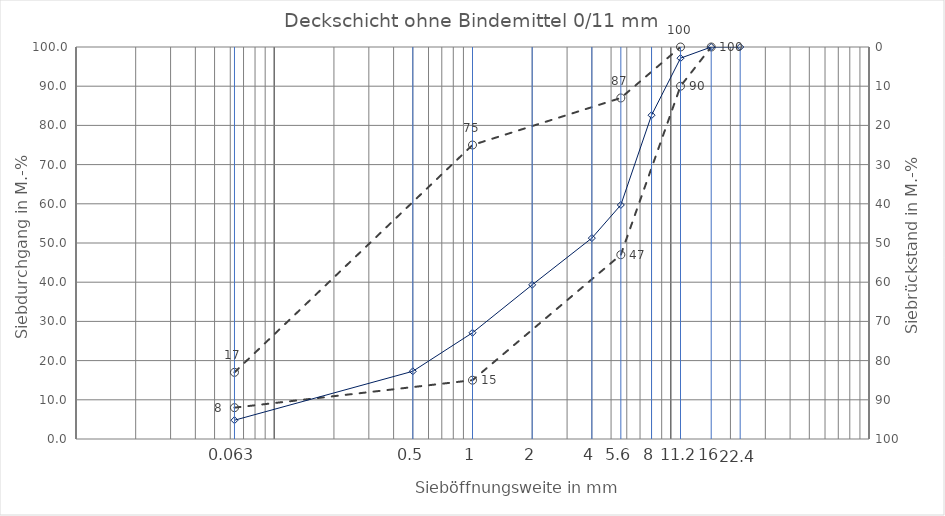
| Category | Series 10 |
|---|---|
| 0.0 | 0 |
| 0.063 | 0 |
| 0.5 | 0 |
| 1.0 | 0 |
| 2.0 | 0 |
| 4.0 | 0 |
| 5.6 | 0 |
| 8.0 | 0 |
| 11.2 | 0 |
| 16.0 | 0 |
| 22.4 | 0 |